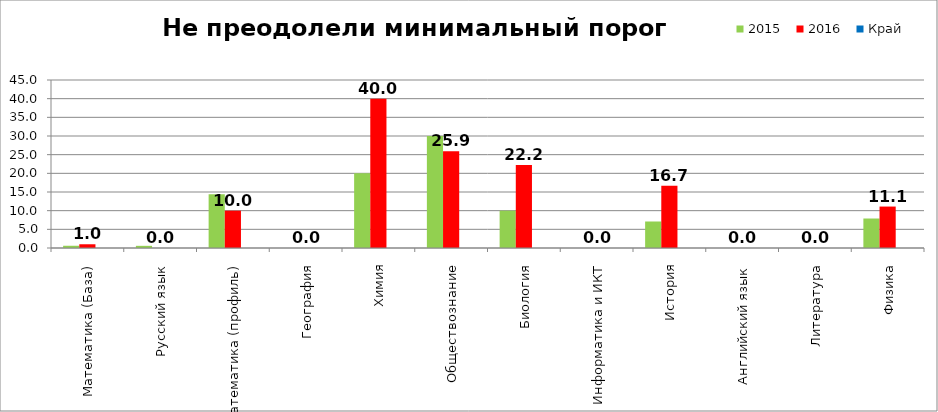
| Category | 2015 | 2016 | Край |
|---|---|---|---|
| Математика (База) | 0.6 | 1 |  |
| Русский язык | 0.58 | 0 |  |
| Математика (профиль) | 14.4 | 10 |  |
| География | 0 | 0 |  |
| Химия | 20 | 40 |  |
| Обществознание | 30 | 25.9 |  |
| Биология | 10 | 22.2 |  |
| Информатика и ИКТ | 0 | 0 |  |
| История | 7.1 | 16.7 |  |
| Английский язык | 0 | 0 |  |
| Литература | 0 | 0 |  |
| Физика | 7.9 | 11.1 |  |